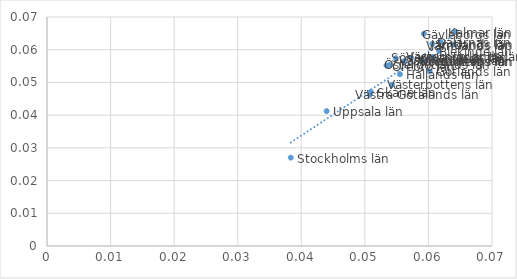
| Category | Andel 73OX av förvärvsarbetande |
|---|---|
| 0.03834969273190977 | 0.027 |
| 0.04398527235969777 | 0.041 |
| 0.05486902210692533 | 0.057 |
| 0.05385932356656741 | 0.055 |
| 0.057285452668922515 | 0.058 |
| 0.059487168768191295 | 0.056 |
| 0.06423790069800024 | 0.066 |
| 0.060201076823892245 | 0.053 |
| 0.061694815459543174 | 0.06 |
| 0.05093865039616393 | 0.047 |
| 0.0555206109586256 | 0.053 |
| 0.05075812072916427 | 0.046 |
| 0.0639026617954071 | 0.062 |
| 0.05340329608401028 | 0.055 |
| 0.056232877749019965 | 0.057 |
| 0.06190842193660418 | 0.062 |
| 0.05928712098362401 | 0.065 |
| 0.06070185365133642 | 0.058 |
| 0.06061581459615626 | 0.062 |
| 0.05427180706057454 | 0.049 |
| 0.058978989560850986 | 0.057 |